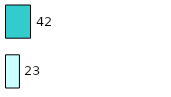
| Category | Series 0 | Series 1 |
|---|---|---|
| 0 | 23 | 42 |